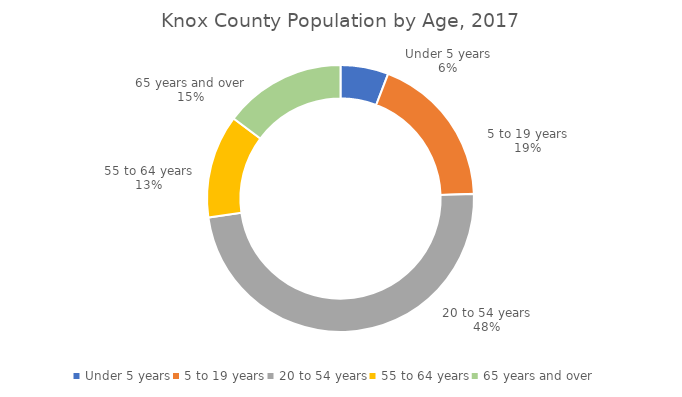
| Category | Knox County |
|---|---|
| Under 5 years | 26263 |
| 5 to 19 years | 84319 |
| 20 to 54 years | 218340 |
| 55 to 64 years | 56567 |
| 65 years and over | 66797 |